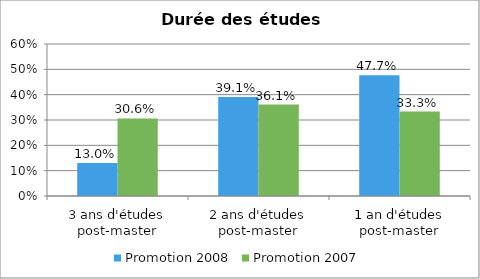
| Category | Promotion 2008 | Promotion 2007 |
|---|---|---|
| 3 ans d'études post-master | 0.13 | 0.306 |
| 2 ans d'études post-master | 0.391 | 0.361 |
| 1 an d'études post-master | 0.477 | 0.333 |